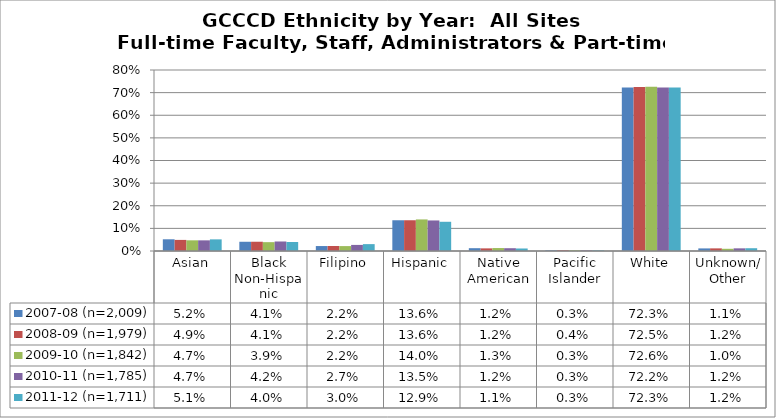
| Category | 2007-08 (n=2,009) | 2008-09 (n=1,979) | 2009-10 (n=1,842) | 2010-11 (n=1,785) | 2011-12 (n=1,711) |
|---|---|---|---|---|---|
| Asian | 0.052 | 0.049 | 0.047 | 0.047 | 0.051 |
| Black Non-Hispanic | 0.041 | 0.041 | 0.039 | 0.042 | 0.04 |
| Filipino | 0.022 | 0.022 | 0.022 | 0.027 | 0.03 |
| Hispanic | 0.136 | 0.136 | 0.14 | 0.135 | 0.129 |
| Native American | 0.012 | 0.012 | 0.013 | 0.012 | 0.011 |
| Pacific Islander | 0.003 | 0.004 | 0.003 | 0.003 | 0.003 |
| White | 0.723 | 0.725 | 0.726 | 0.722 | 0.723 |
| Unknown/ Other | 0.011 | 0.012 | 0.01 | 0.012 | 0.012 |